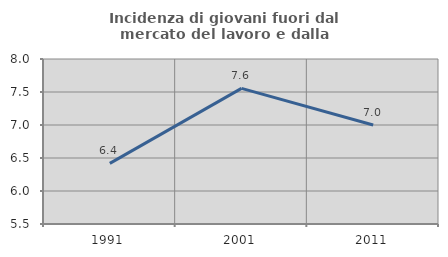
| Category | Incidenza di giovani fuori dal mercato del lavoro e dalla formazione  |
|---|---|
| 1991.0 | 6.419 |
| 2001.0 | 7.556 |
| 2011.0 | 7 |